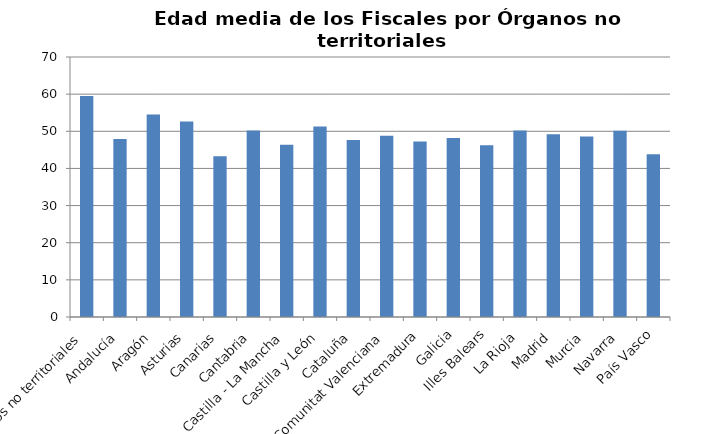
| Category | Edad Media |
|---|---|
| Órganos no territoriales | 59.5 |
| Andalucía | 47.95 |
| Aragón | 54.55 |
| Asturias | 52.62 |
| Canarias | 43.27 |
| Cantabria | 50.22 |
| Castilla - La Mancha | 46.36 |
| Castilla y León | 51.26 |
| Cataluña | 47.68 |
| Comunitat Valenciana | 48.81 |
| Extremadura | 47.25 |
| Galicia | 48.17 |
| Illes Balears | 46.27 |
| La Rioja | 50.23 |
| Madrid | 49.2 |
| Murcia | 48.57 |
| Navarra | 50.14 |
| País Vasco | 43.8 |